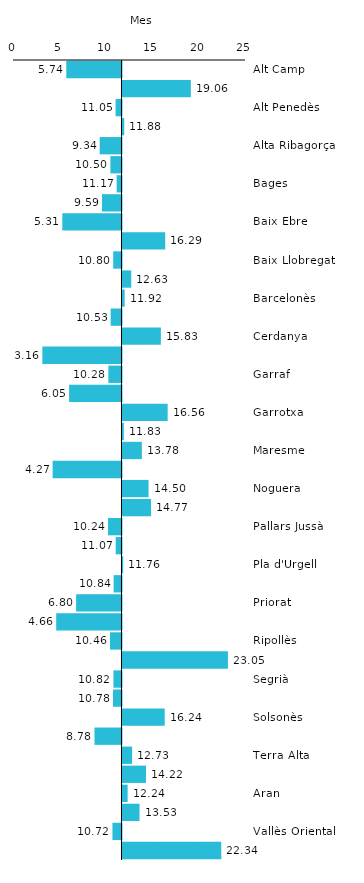
| Category | Series 0 |
|---|---|
| Alt Camp | 5.741 |
| Alt Empordà | 19.059 |
| Alt Penedès | 11.053 |
| Alt Urgell | 11.879 |
| Alta Ribagorça | 9.341 |
| Anoia | 10.495 |
| Bages | 11.169 |
| Baix Camp | 9.59 |
| Baix Ebre | 5.314 |
| Baix Empordà | 16.294 |
| Baix Llobregat | 10.795 |
| Baix Penedès | 12.634 |
| Barcelonès | 11.922 |
| Berguedà | 10.526 |
| Cerdanya | 15.827 |
| Conca de Barberà | 3.161 |
| Garraf | 10.277 |
| Garrigues | 6.047 |
| Garrotxa | 16.559 |
| Gironès | 11.831 |
| Maresme | 13.777 |
| Montsià | 4.268 |
| Noguera | 14.498 |
| Osona | 14.768 |
| Pallars Jussà | 10.241 |
| Pallars Sobirà | 11.066 |
| Pla d'Urgell | 11.765 |
| Pla de l'Estany | 10.842 |
| Priorat | 6.803 |
| Ribera d'Ebre | 4.656 |
| Ripollès | 10.456 |
| Segarra | 23.051 |
| Segrià | 10.821 |
| Selva | 10.777 |
| Solsonès | 16.239 |
| Tarragonès | 8.779 |
| Terra Alta | 12.727 |
| Urgell | 14.224 |
| Aran | 12.243 |
| Vallès Occidental | 13.526 |
| Vallès Oriental | 10.716 |
| Moianès | 22.335 |